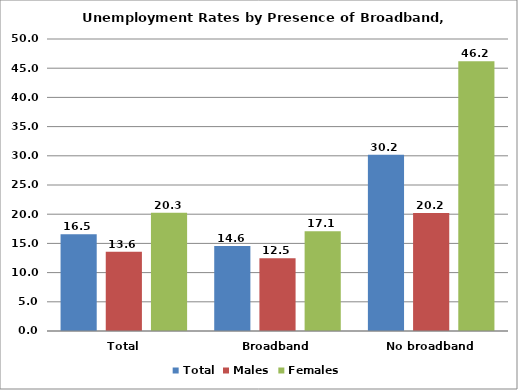
| Category | Total | Males | Females |
|---|---|---|---|
| Total | 16.55 | 13.56 | 20.269 |
| Broadband | 14.555 | 12.456 | 17.074 |
| No broadband | 30.189 | 20.21 | 46.188 |